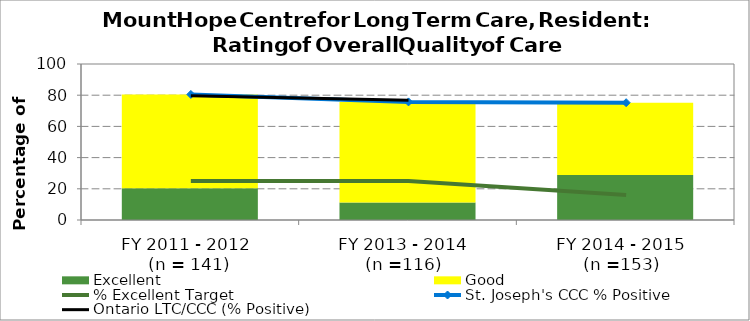
| Category | Excellent | Good |
|---|---|---|
| FY 2011 - 2012 
(n = 141) | 20.3 | 60.2 |
| FY 2013 - 2014 
(n =116)  | 11.2 | 64.5 |
| FY 2014 - 2015 
(n =153)  | 28.8 | 46.4 |